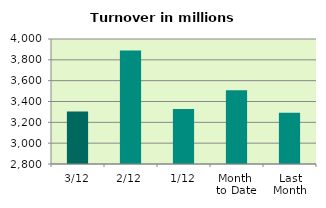
| Category | Series 0 |
|---|---|
| 3/12 | 3304.6 |
| 2/12 | 3889.618 |
| 1/12 | 3328.986 |
| Month 
to Date | 3507.735 |
| Last
Month | 3292.145 |